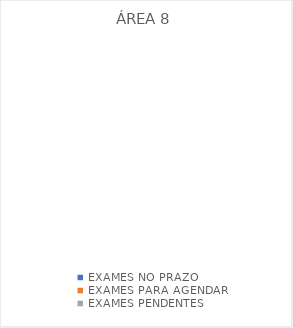
| Category | ÁREA 8 |
|---|---|
| EXAMES NO PRAZO | 0 |
| EXAMES PARA AGENDAR | 0 |
| EXAMES PENDENTES | 0 |